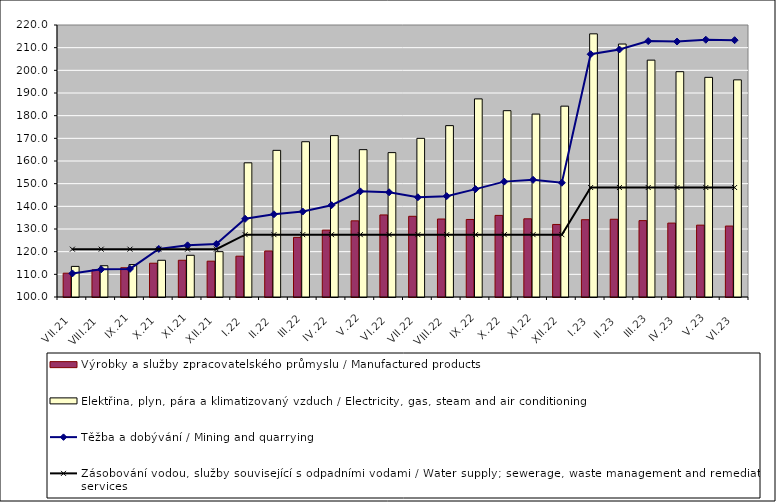
| Category | Výrobky a služby zpracovatelského průmyslu / Manufactured products | Elektřina, plyn, pára a klimatizovaný vzduch / Electricity, gas, steam and air conditioning |
|---|---|---|
| VII.21 | 110.5 | 113.5 |
| VIII.21 | 112 | 113.8 |
| IX.21 | 112.9 | 114.3 |
| X.21 | 114.9 | 116.2 |
| XI.21 | 116.2 | 118.4 |
| XII.21 | 115.8 | 120 |
| I.22 | 118 | 159.2 |
| II.22 | 120.3 | 164.7 |
| III.22 | 126.3 | 168.5 |
| IV.22 | 129.5 | 171.2 |
| V.22 | 133.6 | 165 |
| VI.22 | 136.2 | 163.7 |
| VII.22 | 135.6 | 170 |
| VIII.22 | 134.4 | 175.6 |
| IX.22 | 134.2 | 187.4 |
| X.22 | 136 | 182.2 |
| XI.22 | 134.5 | 180.7 |
| XII.22 | 132 | 184.2 |
| I.23 | 134.1 | 216.1 |
| II.23 | 134.3 | 211.6 |
| III.23 | 133.7 | 204.5 |
| IV.23 | 132.6 | 199.4 |
| V.23 | 131.7 | 196.9 |
| VI.23 | 131.3 | 195.8 |